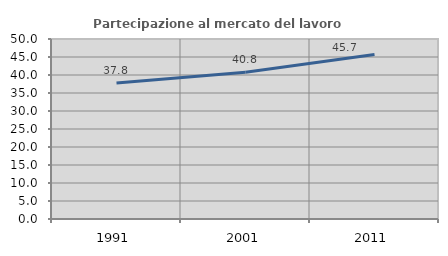
| Category | Partecipazione al mercato del lavoro  femminile |
|---|---|
| 1991.0 | 37.757 |
| 2001.0 | 40.785 |
| 2011.0 | 45.679 |